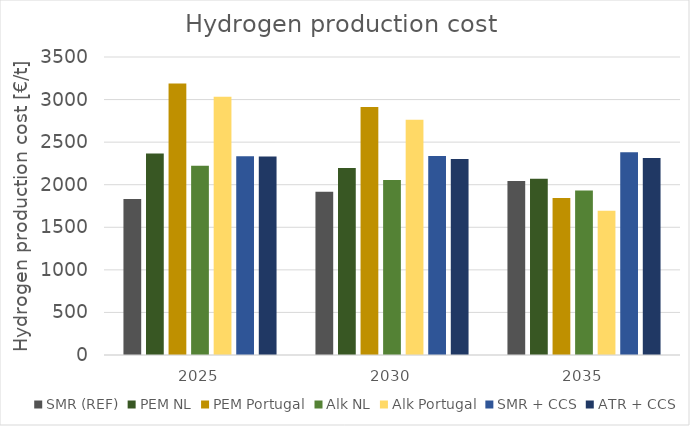
| Category | SMR (REF) | PEM NL | PEM Portugal | Alk NL | Alk Portugal | SMR + CCS | ATR + CCS  |
|---|---|---|---|---|---|---|---|
| 2025.0 | 1832.018 | 2367.749 | 3189.042 | 2222.781 | 3032.864 | 2334.165 | 2331.026 |
| 2030.0 | 1916.918 | 2196.244 | 2914.068 | 2055.805 | 2762.77 | 2336.715 | 2301.446 |
| 2035.0 | 2044.268 | 2069.739 | 1843.282 | 1931.461 | 1694.311 | 2381.715 | 2314.316 |